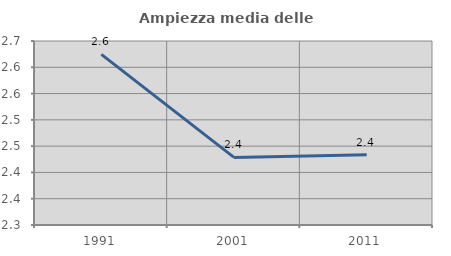
| Category | Ampiezza media delle famiglie |
|---|---|
| 1991.0 | 2.625 |
| 2001.0 | 2.429 |
| 2011.0 | 2.434 |